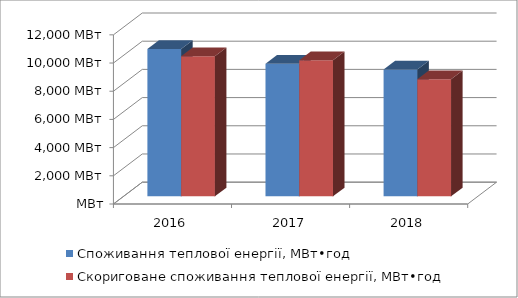
| Category | Споживання теплової енергії, МВт•год | Скориговане споживання теплової енергії, МВт•год |
|---|---|---|
| 2016.0 | 10447.725 | 9940.017 |
| 2017.0 | 9410.643 | 9652.114 |
| 2018.0 | 8992.438 | 8302.931 |